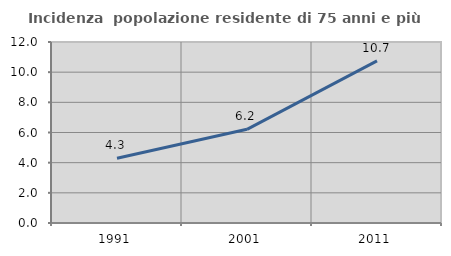
| Category | Incidenza  popolazione residente di 75 anni e più |
|---|---|
| 1991.0 | 4.291 |
| 2001.0 | 6.21 |
| 2011.0 | 10.746 |